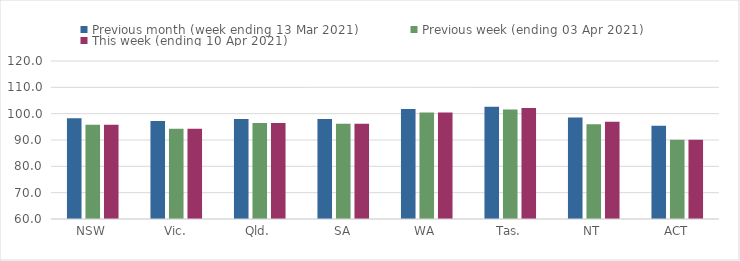
| Category | Previous month (week ending 13 Mar 2021) | Previous week (ending 03 Apr 2021) | This week (ending 10 Apr 2021) |
|---|---|---|---|
| NSW | 98.28 | 95.79 | 95.79 |
| Vic. | 97.24 | 94.27 | 94.27 |
| Qld. | 97.95 | 96.43 | 96.43 |
| SA | 97.99 | 96.15 | 96.15 |
| WA | 101.75 | 100.49 | 100.49 |
| Tas. | 102.58 | 101.57 | 102.11 |
| NT | 98.55 | 96 | 96.93 |
| ACT | 95.45 | 90.12 | 90.12 |